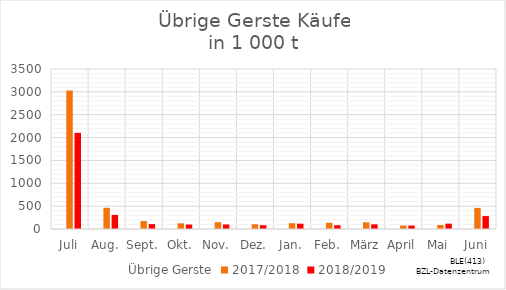
| Category | Übrige Gerste | 2017/2018 | 2018/2019 |
|---|---|---|---|
| Juli |  | 3028.416 | 2103.461 |
| Aug. |  | 464.692 | 308.225 |
| Sept. |  | 172.903 | 106.702 |
| Okt. |  | 124.183 | 97.904 |
| Nov. |  | 149.708 | 99.31 |
| Dez. |  | 102.847 | 83.064 |
| Jan. |  | 126.305 | 116.22 |
| Feb. |  | 136.174 | 82.763 |
| März |  | 146.459 | 101.722 |
| April |  | 75.603 | 75.548 |
| Mai |  | 87.924 | 116.632 |
| Juni |  | 461.701 | 282.274 |